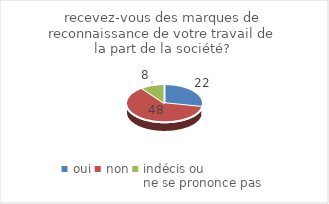
| Category | recevez-vous des marques de reconnaissance de votre travail de la part de la société? |
|---|---|
| oui | 22 |
| non | 48 |
| indécis ou 
ne se prononce pas | 8 |